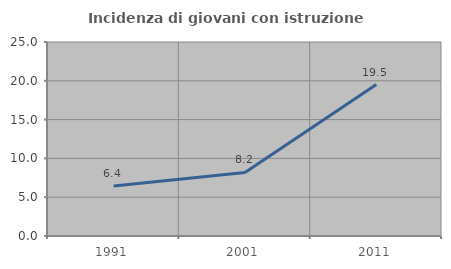
| Category | Incidenza di giovani con istruzione universitaria |
|---|---|
| 1991.0 | 6.429 |
| 2001.0 | 8.197 |
| 2011.0 | 19.512 |